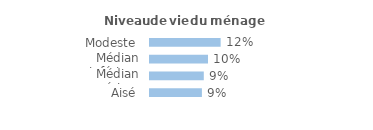
| Category | Series 0 |
|---|---|
| Modeste | 0.122 |
| Médian inférieur | 0.101 |
| Médian supérieur | 0.093 |
| Aisé | 0.09 |